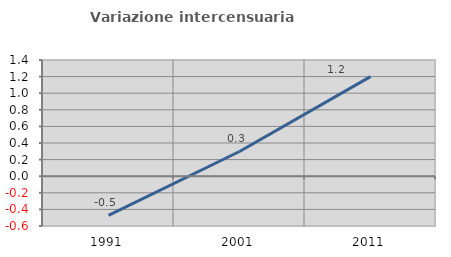
| Category | Variazione intercensuaria annua |
|---|---|
| 1991.0 | -0.472 |
| 2001.0 | 0.298 |
| 2011.0 | 1.2 |